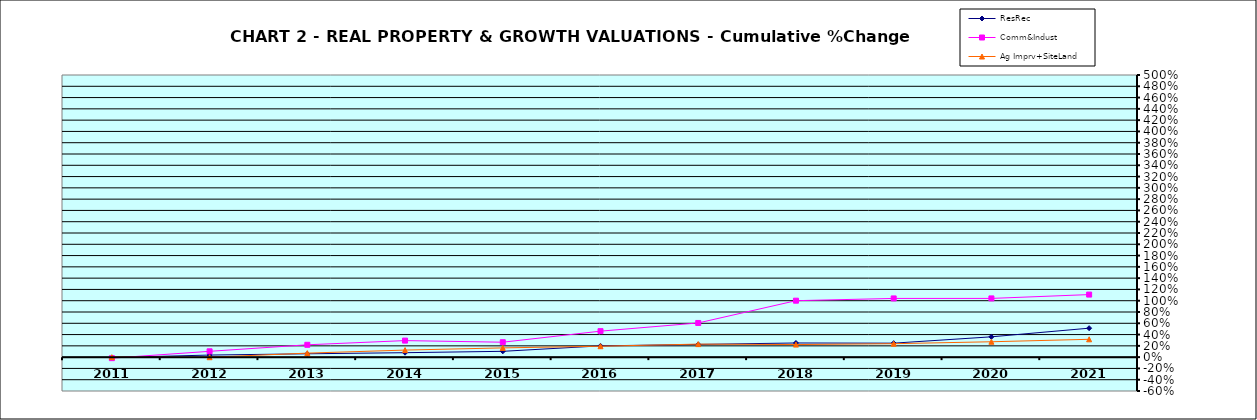
| Category | ResRec | Comm&Indust | Ag Imprv+SiteLand |
|---|---|---|---|
| 2011.0 | -0.008 | -0.018 | 0 |
| 2012.0 | 0.037 | 0.103 | -0.001 |
| 2013.0 | 0.059 | 0.219 | 0.071 |
| 2014.0 | 0.079 | 0.293 | 0.125 |
| 2015.0 | 0.103 | 0.265 | 0.164 |
| 2016.0 | 0.2 | 0.461 | 0.194 |
| 2017.0 | 0.226 | 0.606 | 0.231 |
| 2018.0 | 0.251 | 1.001 | 0.223 |
| 2019.0 | 0.248 | 1.04 | 0.238 |
| 2020.0 | 0.36 | 1.041 | 0.273 |
| 2021.0 | 0.513 | 1.109 | 0.316 |